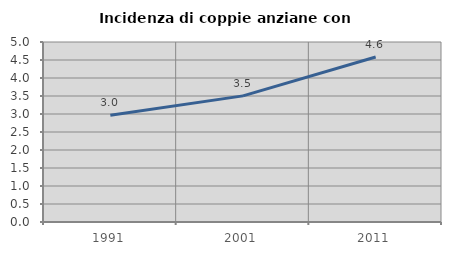
| Category | Incidenza di coppie anziane con figli |
|---|---|
| 1991.0 | 2.965 |
| 2001.0 | 3.504 |
| 2011.0 | 4.583 |